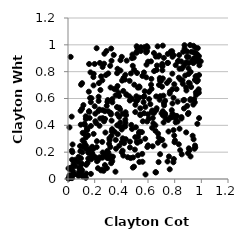
| Category | Series 0 |
|---|---|
| 0.7836342504068851 | 0.911 |
| 0.5610615064754484 | 0.43 |
| 0.04253485079842576 | 0.117 |
| 0.919891491295028 | 0.799 |
| 0.9515869209305778 | 0.738 |
| 0.5205785303169262 | 0.27 |
| 0.3262155400384781 | 0.322 |
| 0.6446854060187953 | 0.939 |
| 0.535160524778381 | 0.127 |
| 0.5935872876621674 | 0.429 |
| 0.534909024585252 | 0.607 |
| 0.2595380502048091 | 0.835 |
| 0.8655837116887714 | 0.586 |
| 0.13361825662190904 | 0.447 |
| 0.6056085689123091 | 0.449 |
| 0.20532825203499436 | 0.43 |
| 0.1688141165076407 | 0.795 |
| 0.10783027642858285 | 0.199 |
| 0.8670050182637795 | 0.84 |
| 0.2764689434769459 | 0.505 |
| 0.13324119266326725 | 0.308 |
| 0.9051945486520051 | 0.718 |
| 0.25927888224184875 | 0.513 |
| 0.1350354829395176 | 0.249 |
| 0.8743601571822789 | 0.972 |
| 0.032825821279329315 | 0.2 |
| 0.30267499963031913 | 0.505 |
| 0.35803701581496883 | 0.291 |
| 0.5424560325676623 | 0.281 |
| 0.37026893233019714 | 0.483 |
| 0.7836252910030995 | 0.669 |
| 0.5458763430222952 | 0.954 |
| 0.2592710910028215 | 0.159 |
| 0.9817306644293472 | 0.916 |
| 0.36732922168364524 | 0.536 |
| 0.23712059282582626 | 0.162 |
| 0.9587434187647836 | 0.936 |
| 0.9112938751995172 | 0.214 |
| 0.18794761554298456 | 0.223 |
| 0.5696512092485299 | 0.794 |
| 0.9761535961713298 | 0.658 |
| 0.1330325787023337 | 0.467 |
| 0.8441632748105674 | 0.74 |
| 0.09441787526968488 | 0.508 |
| 0.42963028463660735 | 0.442 |
| 0.25678347864624784 | 0.276 |
| 0.9414454121000605 | 0.993 |
| 0.6870681243370528 | 0.591 |
| 0.4718904579547721 | 0.787 |
| 0.5366587110782195 | 0.352 |
| 0.7826272741505005 | 0.93 |
| 0.21505620234439843 | 0.238 |
| 0.12257094637206437 | 0.412 |
| 0.19162183388206872 | 0.698 |
| 0.012228305892225474 | 0.075 |
| 0.08497778606495338 | 0.084 |
| 0.24195788789625264 | 0.451 |
| 0.7277438120638807 | 0.487 |
| 0.9528020199710424 | 0.877 |
| 0.3569627657817646 | 0.623 |
| 0.7164248464082997 | 0.489 |
| 0.836388045261852 | 0.821 |
| 0.1811758119070041 | 0.24 |
| 0.6593713744134111 | 0.05 |
| 0.1716184984122249 | 0.038 |
| 0.7079854282561578 | 0.839 |
| 0.887742561320369 | 0.87 |
| 0.8225464070149779 | 0.576 |
| 0.9399253503604587 | 0.554 |
| 0.5014864261002099 | 0.219 |
| 0.6222263062255006 | 0.877 |
| 0.32364193463691143 | 0.118 |
| 0.6884708741459176 | 0.752 |
| 0.7629904270691321 | 0.072 |
| 0.47453201417991225 | 0.403 |
| 0.22683987868806646 | 0.505 |
| 0.5422198982311248 | 0.476 |
| 0.426711481232801 | 0.741 |
| 0.0363782953368485 | 0.06 |
| 0.11040940128148442 | 0.24 |
| 0.024563854678855294 | 0.027 |
| 0.9332771118689898 | 0.879 |
| 0.1425951003818985 | 0.376 |
| 0.1528863314693442 | 0.195 |
| 0.2842890452612577 | 0.774 |
| 0.2035293773101309 | 0.163 |
| 0.7915133482140569 | 0.922 |
| 0.16709836890116866 | 0.159 |
| 0.2606591528599608 | 0.454 |
| 0.9510864196329474 | 0.571 |
| 0.0068524915121784885 | 0.006 |
| 0.5860361646602784 | 0.943 |
| 0.7677849466444505 | 0.46 |
| 0.9666299757965925 | 0.726 |
| 0.28061807326948657 | 0.346 |
| 0.7716873250788094 | 0.951 |
| 0.5544413713032634 | 0.349 |
| 0.5704808339654581 | 0.491 |
| 0.48020988595019376 | 0.373 |
| 0.5424256246201633 | 0.482 |
| 0.09738600316323406 | 0.049 |
| 0.572227929431 | 0.618 |
| 0.13409205110806047 | 0.009 |
| 0.5741111100016631 | 0.983 |
| 0.6642555693954686 | 0.812 |
| 0.3263997372313648 | 0.881 |
| 0.9637957779567464 | 0.767 |
| 0.38332390357631213 | 0.619 |
| 0.3222127745733256 | 0.481 |
| 0.11057872092615294 | 0.026 |
| 0.514640309522878 | 0.941 |
| 0.4634987756782277 | 0.585 |
| 0.8859332826750396 | 0.682 |
| 0.9044468148687503 | 0.783 |
| 0.7813589759911069 | 0.952 |
| 0.3271241369876705 | 0.435 |
| 0.07926225807148951 | 0.024 |
| 0.7782652049029435 | 0.513 |
| 0.12295453079391357 | 0.27 |
| 0.05287051434511445 | 0.097 |
| 0.24312128135219788 | 0.663 |
| 0.9488324230369898 | 0.225 |
| 0.14986530997600658 | 0.325 |
| 0.4031088951298152 | 0.2 |
| 0.9238090531202623 | 0.686 |
| 0.5867123418497034 | 0.758 |
| 0.6964143117082784 | 0.729 |
| 0.9670014349147732 | 0.906 |
| 0.27689757736042014 | 0.104 |
| 0.3599441634581176 | 0.226 |
| 0.33191755539467765 | 0.132 |
| 0.626387371202488 | 0.671 |
| 0.15204545936819508 | 0.153 |
| 0.9038742301631937 | 0.493 |
| 0.23610347014046976 | 0.397 |
| 0.822017863629243 | 0.428 |
| 0.3924261134031154 | 0.421 |
| 0.558306492502851 | 0.768 |
| 0.5149265396519943 | 0.989 |
| 0.5176370904666233 | 0.79 |
| 0.42974661900107014 | 0.776 |
| 0.6670209246698613 | 0.846 |
| 0.5093509846798908 | 0.385 |
| 0.5045507806778612 | 0.499 |
| 0.34670697953051716 | 0.671 |
| 0.4295321046530319 | 0.391 |
| 0.7109127055608829 | 0.994 |
| 0.27300403250683014 | 0.934 |
| 0.08605168220441656 | 0.08 |
| 0.356038258137315 | 0.054 |
| 0.38294355092932697 | 0.395 |
| 0.22474986976422578 | 0.08 |
| 0.04010199040089313 | 0.034 |
| 0.45983457942006795 | 0.616 |
| 0.27650658375352605 | 0.176 |
| 0.8699822472818761 | 0.526 |
| 0.497074842817009 | 0.703 |
| 0.0038043331004514657 | 0.079 |
| 0.6007583573000377 | 0.874 |
| 0.9035387737002814 | 0.825 |
| 0.011265466623986585 | 0.019 |
| 0.9589785983469751 | 0.646 |
| 0.4045433981877948 | 0.275 |
| 0.7111208629227787 | 0.505 |
| 0.19267030536697924 | 0.784 |
| 0.11062912517734452 | 0.019 |
| 0.5248580293881849 | 0.177 |
| 0.7826408919828249 | 0.785 |
| 0.10637519694739099 | 0.064 |
| 0.8244402500037893 | 0.878 |
| 0.8069233034270423 | 0.449 |
| 0.7157932103250816 | 0.621 |
| 0.27068111821212815 | 0.859 |
| 0.11917764597801551 | 0.339 |
| 0.6558796176243049 | 0.359 |
| 0.7077905228257287 | 0.81 |
| 0.14047513848605342 | 0.364 |
| 0.9526415718387587 | 0.249 |
| 0.5913401305096545 | 0.99 |
| 0.43116478059100316 | 0.418 |
| 0.4950841686361935 | 0.092 |
| 0.9386814635409755 | 0.886 |
| 0.029537385042505714 | 0.006 |
| 0.9456350514796672 | 0.9 |
| 0.8509923986562751 | 0.451 |
| 0.37900394316934943 | 0.641 |
| 0.16095330313955886 | 0.222 |
| 0.30201675527551675 | 0.787 |
| 0.8076945644307832 | 0.849 |
| 0.6646597859041016 | 0.527 |
| 0.15744548934908492 | 0.505 |
| 0.24775471328107587 | 0.064 |
| 0.3370061595321673 | 0.166 |
| 0.020875380017094484 | 0.085 |
| 0.3080688869714902 | 0.262 |
| 0.4862811628049438 | 0.085 |
| 0.29387610097104483 | 0.157 |
| 0.9061629733746279 | 0.229 |
| 0.894010690356628 | 0.545 |
| 0.9808833147173115 | 0.872 |
| 0.5258243181658103 | 0.316 |
| 0.1779391125006688 | 0.181 |
| 0.830052390853189 | 0.881 |
| 0.33210449940518355 | 0.596 |
| 0.029109592936268813 | 0.212 |
| 0.1043956518891998 | 0.114 |
| 0.7832945805680482 | 0.488 |
| 0.137033969581061 | 0.04 |
| 0.9252480836839286 | 0.948 |
| 0.5948156221365792 | 0.238 |
| 0.020671301865685266 | 0.018 |
| 0.7236874126608916 | 0.25 |
| 0.5210233719876468 | 0.973 |
| 0.29556580904234137 | 0.574 |
| 0.6073837001314768 | 0.649 |
| 0.747674768510308 | 0.865 |
| 0.030766748163459173 | 0.144 |
| 0.7914551010198689 | 0.605 |
| 0.31070712364972564 | 0.304 |
| 0.19043989199974506 | 0.76 |
| 0.0776470600537082 | 0.029 |
| 0.4833674373762689 | 0.927 |
| 0.4321514121701264 | 0.497 |
| 0.40329635216126025 | 0.91 |
| 0.7903863762593618 | 0.125 |
| 0.983289768368837 | 0.884 |
| 0.3682420418985082 | 0.789 |
| 0.656448835549177 | 0.05 |
| 0.7571899881519264 | 0.168 |
| 0.3196776894422961 | 0.682 |
| 0.7071372236132467 | 0.292 |
| 0.032231023727963735 | 0.09 |
| 0.4480596518510241 | 0.162 |
| 0.8142284959996465 | 0.67 |
| 0.5566579636884914 | 0.187 |
| 0.4620873290035026 | 0.731 |
| 0.13683002631151178 | 0.106 |
| 0.09793165447313347 | 0.703 |
| 0.8506292046891571 | 0.876 |
| 0.9459363964329232 | 0.595 |
| 0.22963656057598392 | 0.581 |
| 0.6586767920812567 | 0.912 |
| 0.09054605069815674 | 0.246 |
| 0.5586132850935173 | 0.129 |
| 0.19438967130145224 | 0.165 |
| 0.11004782452228187 | 0.344 |
| 0.21771461373087958 | 0.132 |
| 0.2939422891401281 | 0.169 |
| 0.011116534933453137 | 0.385 |
| 0.009561432556851145 | 0.005 |
| 0.9181570681134394 | 0.595 |
| 0.2952332722569556 | 0.21 |
| 0.3622599260689898 | 0.669 |
| 0.46942206476297443 | 0.156 |
| 0.8163182794573406 | 0.47 |
| 0.30254392220840254 | 0.196 |
| 0.24861002457858328 | 0.765 |
| 0.8414550526376748 | 0.215 |
| 0.7076231807522518 | 0.845 |
| 0.5753966364717134 | 0.654 |
| 0.7834935146353175 | 0.563 |
| 0.9798926652995741 | 0.669 |
| 0.631451038389089 | 0.51 |
| 0.3238526098112166 | 0.972 |
| 0.14704951873048597 | 0.12 |
| 0.6357622402391256 | 0.454 |
| 0.485762752329635 | 0.844 |
| 0.3934970571628466 | 0.885 |
| 0.5360260167401752 | 0.683 |
| 0.8792576307999055 | 0.859 |
| 0.6176272079697361 | 0.558 |
| 0.7744894800922796 | 0.458 |
| 0.16214986758787187 | 0.455 |
| 0.8076150535889263 | 0.423 |
| 0.9827387801510663 | 0.775 |
| 0.38477771535704586 | 0.248 |
| 0.5887300335160209 | 0.852 |
| 0.8638256686011576 | 0.948 |
| 0.9544741743800916 | 0.235 |
| 0.786495014297598 | 0.466 |
| 0.10971632531939149 | 0.288 |
| 0.21523876223251712 | 0.154 |
| 0.8058321510309349 | 0.47 |
| 0.74930701337199 | 0.866 |
| 0.40993693811176357 | 0.486 |
| 0.46463743531469526 | 0.278 |
| 0.4146175567214275 | 0.656 |
| 0.6845077318387539 | 0.921 |
| 0.25735218318324266 | 0.735 |
| 0.18338893733346037 | 0.186 |
| 0.04508362697099221 | 0.036 |
| 0.10587039386459116 | 0.714 |
| 0.9130370049301854 | 0.712 |
| 0.41849046821893376 | 0.392 |
| 0.17099103703002952 | 0.573 |
| 0.6294981507672247 | 0.499 |
| 0.6399102883799391 | 0.415 |
| 0.034326803451311824 | 0.257 |
| 0.9733237524440608 | 0.975 |
| 0.09611389683674065 | 0.075 |
| 0.5668498267320204 | 0.572 |
| 0.8590916988243759 | 0.736 |
| 0.34307233451632424 | 0.925 |
| 0.6002995255284508 | 0.251 |
| 0.03485596745401002 | 0.032 |
| 0.6000120827016069 | 0.482 |
| 0.8883311571375736 | 0.66 |
| 0.8998021200401852 | 0.484 |
| 0.8714863055593917 | 0.589 |
| 0.8863345188830059 | 0.347 |
| 0.505204595065919 | 0.553 |
| 0.3839770685992716 | 0.532 |
| 0.6459274577924962 | 0.804 |
| 0.40301203937959607 | 0.369 |
| 0.01986275523304815 | 0.91 |
| 0.02757475492894427 | 0.465 |
| 0.4929877831620017 | 0.904 |
| 0.6742079605107384 | 0.27 |
| 0.8542350902843547 | 0.823 |
| 0.3067165514737481 | 0.153 |
| 0.05614428223756075 | 0.144 |
| 0.7208203279104927 | 0.549 |
| 0.6348876664146957 | 0.244 |
| 0.1658752466094719 | 0.604 |
| 0.15606638771267828 | 0.651 |
| 0.7515539334960832 | 0.44 |
| 0.07951421797629563 | 0.05 |
| 0.7987692504677983 | 0.274 |
| 0.6083626464276656 | 0.596 |
| 0.6957788288965371 | 0.745 |
| 0.9154256852626704 | 0.998 |
| 0.934849076437791 | 0.322 |
| 0.001971498184763978 | 0.003 |
| 0.23209863155457722 | 0.715 |
| 0.3275375072178403 | 0.15 |
| 0.32859965557557064 | 0.355 |
| 0.74657109487378 | 0.131 |
| 0.9175619117875875 | 0.587 |
| 0.8923870244972278 | 0.911 |
| 0.42062131397238933 | 0.267 |
| 0.6908586851012376 | 0.185 |
| 0.27785416876000524 | 0.448 |
| 0.13333907593864286 | 0.226 |
| 0.7290016197606954 | 0.479 |
| 0.015999263000622595 | 0.018 |
| 0.6755522267737167 | 0.338 |
| 0.7971269301336773 | 0.706 |
| 0.48827786832133285 | 0.16 |
| 0.900369261120439 | 0.192 |
| 0.15231710128810444 | 0.2 |
| 0.20483547931032337 | 0.487 |
| 0.38385212265724045 | 0.463 |
| 0.4380386401323191 | 0.631 |
| 0.29089622239394547 | 0.195 |
| 0.4401506565661471 | 0.882 |
| 0.43810780754677964 | 0.629 |
| 0.25342757364578644 | 0.161 |
| 0.8024134783565795 | 0.287 |
| 0.3714870645836961 | 0.693 |
| 0.23449132653130433 | 0.518 |
| 0.47923551367935796 | 0.901 |
| 0.9812466354209001 | 0.643 |
| 0.6795025389477755 | 0.126 |
| 0.09741453643930545 | 0.154 |
| 0.6606601854283898 | 0.513 |
| 0.8366246261355161 | 0.375 |
| 0.22435986271987046 | 0.141 |
| 0.6555589572320099 | 0.4 |
| 0.2722372027504745 | 0.175 |
| 0.4793396374968392 | 0.598 |
| 0.7602361683636253 | 0.735 |
| 0.9955339351905771 | 0.877 |
| 0.3690103086457127 | 0.401 |
| 0.33058117631188005 | 0.372 |
| 0.5971461074333165 | 0.98 |
| 0.19982772624681816 | 0.857 |
| 0.5800145223323931 | 0.537 |
| 0.9830620072830832 | 0.454 |
| 0.7126669711366619 | 0.474 |
| 0.31741322337328937 | 0.239 |
| 0.9394495089573958 | 0.864 |
| 0.49557655183310584 | 0.814 |
| 0.31644144969928206 | 0.844 |
| 0.6805829128887977 | 0.309 |
| 0.229666526117614 | 0.613 |
| 0.6231315161519567 | 0.702 |
| 0.6779829160776755 | 0.912 |
| 0.15846892749206637 | 0.857 |
| 0.9324883476857415 | 0.876 |
| 0.9564943325231634 | 0.977 |
| 0.7111732133163785 | 0.75 |
| 0.2388440702161063 | 0.865 |
| 0.2886191118984286 | 0.954 |
| 0.9567957305134505 | 0.765 |
| 0.6445238366253782 | 0.492 |
| 0.5234454104440447 | 0.681 |
| 0.6893609479028185 | 0.736 |
| 0.04643220531507209 | 0.036 |
| 0.12650754980639978 | 0.405 |
| 0.43587057830357 | 0.476 |
| 0.7063332935236595 | 0.858 |
| 0.9051071676487742 | 0.864 |
| 0.3491766466247901 | 0.352 |
| 0.9615070427740815 | 0.627 |
| 0.5108293222304686 | 0.581 |
| 0.5130371872011856 | 0.945 |
| 0.4098415640140913 | 0.211 |
| 0.7192818947883346 | 0.566 |
| 0.519291955696966 | 0.585 |
| 0.8510188713138795 | 0.462 |
| 0.14486268010399658 | 0.367 |
| 0.7966647080222824 | 0.324 |
| 0.2918633944896065 | 0.081 |
| 0.2983903902334566 | 0.588 |
| 0.5344461514137832 | 0.69 |
| 0.7286999989163859 | 0.582 |
| 0.4164264531628249 | 0.753 |
| 0.5470133654801188 | 0.982 |
| 0.8790461850417728 | 0.771 |
| 0.9701485739486181 | 0.411 |
| 0.7644148686742077 | 0.651 |
| 0.01158039009140572 | 0.028 |
| 0.701505586864028 | 0.489 |
| 0.5128095623886411 | 0.617 |
| 0.2165814944949066 | 0.282 |
| 0.25897065452556345 | 0.07 |
| 0.07997223718519768 | 0.165 |
| 0.5159304371260436 | 0.278 |
| 0.9041525811744945 | 0.908 |
| 0.7916304873208345 | 0.364 |
| 0.6722298878657669 | 0.989 |
| 0.2601758401538865 | 0.198 |
| 0.7538297399931094 | 0.354 |
| 0.320131581456971 | 0.493 |
| 0.6252028992684789 | 0.746 |
| 0.39344308634775876 | 0.808 |
| 0.7937097884037322 | 0.149 |
| 0.3326022490258549 | 0.571 |
| 0.37328608246058914 | 0.334 |
| 0.4102362748149963 | 0.303 |
| 0.8738210756769265 | 0.997 |
| 0.8532102021586129 | 0.184 |
| 0.6926793703814828 | 0.618 |
| 0.5792013647339288 | 0.3 |
| 0.10144403277134023 | 0.109 |
| 0.6312778928246892 | 0.382 |
| 0.8612509808391116 | 0.709 |
| 0.27026013310816804 | 0.43 |
| 0.31257964420499995 | 0.29 |
| 0.07662700820930103 | 0.126 |
| 0.17386160458881356 | 0.147 |
| 0.566923493061812 | 0.611 |
| 0.01558935754225271 | 0.009 |
| 0.5322453930975702 | 0.344 |
| 0.8934441970933539 | 0.95 |
| 0.3229753572124319 | 0.169 |
| 0.7628934866413731 | 0.637 |
| 0.5423162637853994 | 0.527 |
| 0.504413717400398 | 0.312 |
| 0.7320886296840892 | 0.452 |
| 0.9739981729310551 | 0.736 |
| 0.10554676560184122 | 0.524 |
| 0.20007928498606195 | 0.542 |
| 0.2903466818943175 | 0.545 |
| 0.21475347582665127 | 0.975 |
| 0.16021703363591924 | 0.5 |
| 0.9441684711239051 | 0.943 |
| 0.6614541474555633 | 0.616 |
| 0.705170185454414 | 0.688 |
| 0.21140255330884325 | 0.416 |
| 0.19222932809925006 | 0.336 |
| 0.3714154500113298 | 0.822 |
| 0.592645067977561 | 0.953 |
| 0.9854180417297533 | 0.848 |
| 0.7169943708335611 | 0.421 |
| 0.7483503414634712 | 0.932 |
| 0.18123943048185723 | 0.19 |
| 0.6823725835390538 | 0.701 |
| 0.4332191785916822 | 0.297 |
| 0.8313241039874203 | 0.755 |
| 0.09297976074042347 | 0.208 |
| 0.17179126059709837 | 0.395 |
| 0.4147505930607594 | 0.175 |
| 0.11549984542328902 | 0.551 |
| 0.7426464821326727 | 0.716 |
| 0.6980739285314226 | 0.29 |
| 0.7190856529747726 | 0.903 |
| 0.5860660948107018 | 0.959 |
| 0.39091931686871295 | 0.519 |
| 0.5813429600122704 | 0.033 |
| 0.83094216911585 | 0.259 |
| 0.4646876431827747 | 0.235 |
| 0.8336542819663011 | 0.924 |
| 0.17611335182882548 | 0.602 |
| 0.2670158940328051 | 0.061 |
| 0.9192570893660379 | 0.168 |
| 0.40567952060982543 | 0.733 |
| 0.9418404584471044 | 0.296 |
| 0.9677120217070115 | 0.931 |
| 0.0960679114253818 | 0.405 |